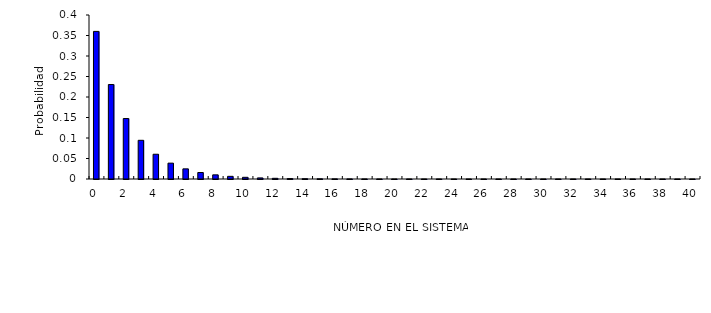
| Category | Series 0 |
|---|---|
| 0.0 | 0.36 |
| 1.0 | 0.23 |
| 2.0 | 0.147 |
| 3.0 | 0.094 |
| 4.0 | 0.06 |
| 5.0 | 0.039 |
| 6.0 | 0.025 |
| 7.0 | 0.016 |
| 8.0 | 0.01 |
| 9.0 | 0.006 |
| 10.0 | 0.004 |
| 11.0 | 0.003 |
| 12.0 | 0.002 |
| 13.0 | 0.001 |
| 14.0 | 0.001 |
| 15.0 | 0 |
| 16.0 | 0 |
| 17.0 | 0 |
| 18.0 | 0 |
| 19.0 | 0 |
| 20.0 | 0 |
| 21.0 | 0 |
| 22.0 | 0 |
| 23.0 | 0 |
| 24.0 | 0 |
| 25.0 | 0 |
| 26.0 | 0 |
| 27.0 | 0 |
| 28.0 | 0 |
| 29.0 | 0 |
| 30.0 | 0 |
| 31.0 | 0 |
| 32.0 | 0 |
| 33.0 | 0 |
| 34.0 | 0 |
| 35.0 | 0 |
| 36.0 | 0 |
| 37.0 | 0 |
| 38.0 | 0 |
| 39.0 | 0 |
| 40.0 | 0 |